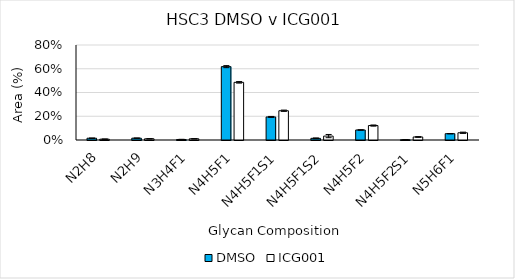
| Category | DMSO | ICG001 |
|---|---|---|
| N2H8 | 0.015 | 0.007 |
| N2H9 | 0.015 | 0.01 |
| N3H4F1 | 0.004 | 0.01 |
| N4H5F1 | 0.618 | 0.486 |
| N4H5F1S1 | 0.194 | 0.246 |
| N4H5F1S2 | 0.014 | 0.033 |
| N4H5F2 | 0.084 | 0.122 |
| N4H5F2S1 | 0.002 | 0.025 |
| N5H6F1 | 0.053 | 0.061 |